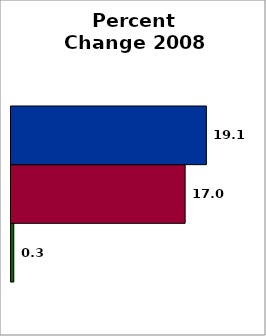
| Category | School | SREB states (average) | 50 states and D.C. (average) |
|---|---|---|---|
| 0 | 0.272 | 16.99 | 19.061 |